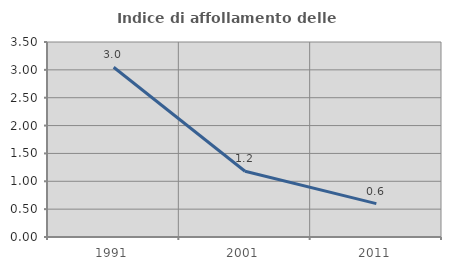
| Category | Indice di affollamento delle abitazioni  |
|---|---|
| 1991.0 | 3.047 |
| 2001.0 | 1.18 |
| 2011.0 | 0.599 |